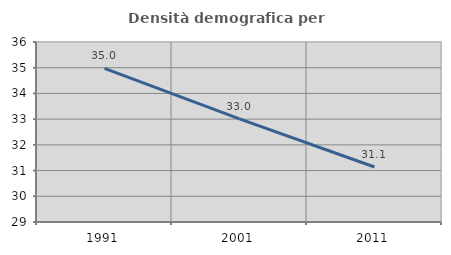
| Category | Densità demografica |
|---|---|
| 1991.0 | 34.976 |
| 2001.0 | 33.009 |
| 2011.0 | 31.138 |